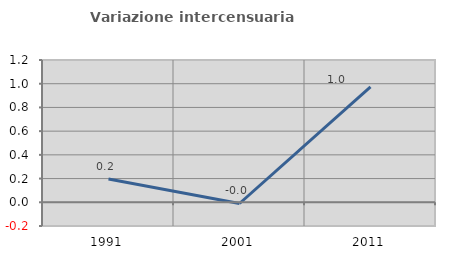
| Category | Variazione intercensuaria annua |
|---|---|
| 1991.0 | 0.196 |
| 2001.0 | -0.01 |
| 2011.0 | 0.973 |